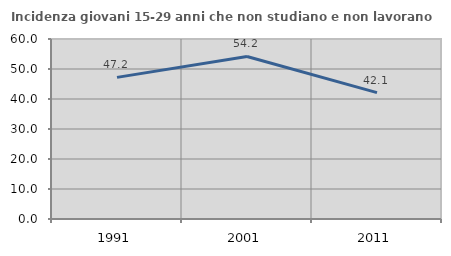
| Category | Incidenza giovani 15-29 anni che non studiano e non lavorano  |
|---|---|
| 1991.0 | 47.205 |
| 2001.0 | 54.184 |
| 2011.0 | 42.11 |